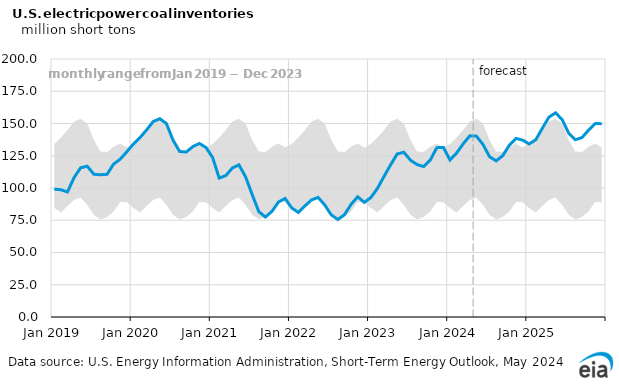
| Category | Electric Power Sector Coal Stocks |
|---|---|
| 0 | 99.145 |
| 1900-01-01 | 98.637 |
| 1900-01-02 | 96.932 |
| 1900-01-03 | 108.072 |
| 1900-01-04 | 115.7 |
| 1900-01-05 | 116.875 |
| 1900-01-06 | 110.661 |
| 1900-01-07 | 110.268 |
| 1900-01-08 | 110.615 |
| 1900-01-09 | 118.566 |
| 1900-01-10 | 122.357 |
| 1900-01-11 | 128.102 |
| 1900-01-12 | 134.134 |
| 1900-01-13 | 139.112 |
| 1900-01-14 | 145.034 |
| 1900-01-15 | 151.534 |
| 1900-01-16 | 153.716 |
| 1900-01-17 | 149.935 |
| 1900-01-18 | 137.149 |
| 1900-01-19 | 128.33 |
| 1900-01-20 | 127.902 |
| 1900-01-21 | 132.058 |
| 1900-01-22 | 134.522 |
| 1900-01-23 | 131.431 |
| 1900-01-24 | 123.705 |
| 1900-01-25 | 107.698 |
| 1900-01-26 | 109.614 |
| 1900-01-27 | 115.505 |
| 1900-01-28 | 117.932 |
| 1900-01-29 | 108.678 |
| 1900-01-30 | 94.974 |
| 1900-01-31 | 81.762 |
| 1900-02-01 | 77.476 |
| 1900-02-02 | 81.88 |
| 1900-02-03 | 89.192 |
| 1900-02-04 | 91.884 |
| 1900-02-05 | 84.541 |
| 1900-02-06 | 81.034 |
| 1900-02-07 | 86.143 |
| 1900-02-08 | 90.746 |
| 1900-02-09 | 92.692 |
| 1900-02-10 | 86.869 |
| 1900-02-11 | 79.172 |
| 1900-02-12 | 75.57 |
| 1900-02-13 | 79.354 |
| 1900-02-14 | 87.342 |
| 1900-02-15 | 93.203 |
| 1900-02-16 | 88.861 |
| 1900-02-17 | 92.604 |
| 1900-02-18 | 99.7 |
| 1900-02-19 | 109.004 |
| 1900-02-20 | 118.035 |
| 1900-02-21 | 126.414 |
| 1900-02-22 | 127.71 |
| 1900-02-23 | 121.59 |
| 1900-02-24 | 118.144 |
| 1900-02-25 | 116.635 |
| 1900-02-26 | 121.621 |
| 1900-02-27 | 131.266 |
| 1900-02-28 | 131.426 |
| 1900-02-28 | 121.722 |
| 1900-03-01 | 127.107 |
| 1900-03-02 | 134.235 |
| 1900-03-03 | 140.437 |
| 1900-03-04 | 140.209 |
| 1900-03-05 | 133.761 |
| 1900-03-06 | 124.227 |
| 1900-03-07 | 121.046 |
| 1900-03-08 | 125.059 |
| 1900-03-09 | 133.28 |
| 1900-03-10 | 138.44 |
| 1900-03-11 | 137.143 |
| 1900-03-12 | 134.136 |
| 1900-03-13 | 137.396 |
| 1900-03-14 | 146.291 |
| 1900-03-15 | 154.928 |
| 1900-03-16 | 158.251 |
| 1900-03-17 | 153.05 |
| 1900-03-18 | 142.456 |
| 1900-03-19 | 137.436 |
| 1900-03-20 | 139.054 |
| 1900-03-21 | 144.755 |
| 1900-03-22 | 149.976 |
| 1900-03-23 | 149.862 |